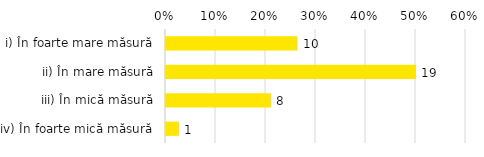
| Category | Total |
|---|---|
| i) În foarte mare măsură | 0.263 |
| ii) În mare măsură | 0.5 |
| iii) În mică măsură | 0.211 |
| iv) În foarte mică măsură | 0.026 |